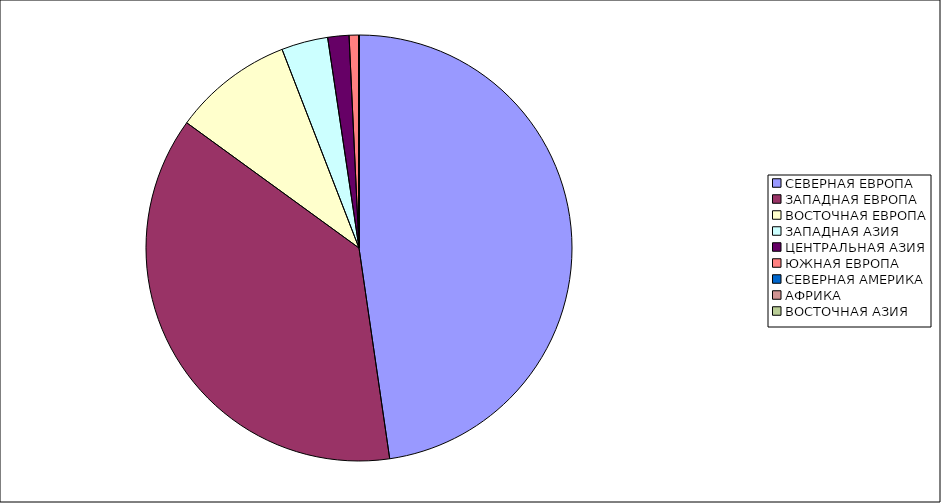
| Category | Оборот |
|---|---|
| СЕВЕРНАЯ ЕВРОПА | 47.695 |
| ЗАПАДНАЯ ЕВРОПА | 37.309 |
| ВОСТОЧНАЯ ЕВРОПА | 9.115 |
| ЗАПАДНАЯ АЗИЯ | 3.525 |
| ЦЕНТРАЛЬНАЯ АЗИЯ | 1.611 |
| ЮЖНАЯ ЕВРОПА | 0.727 |
| СЕВЕРНАЯ АМЕРИКА | 0.014 |
| АФРИКА | 0.003 |
| ВОСТОЧНАЯ АЗИЯ | 0.001 |